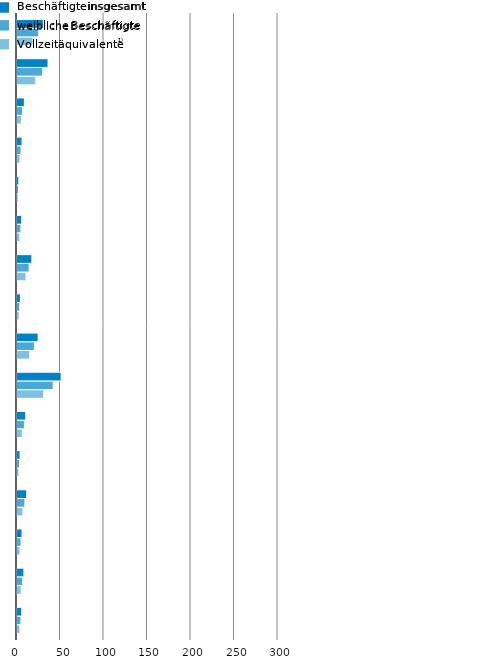
| Category | VZÄ | wB | iB |
|---|---|---|---|
| Thüringen      | 3.334 | 4.5 | 5.509 |
| Schleswig-Holstein | 4.821 | 6.616 | 7.966 |
| Sachsen-Anhalt | 3.498 | 4.671 | 5.779 |
| Sachsen        | 6.768 | 9.048 | 11.182 |
| Saarland | 2.125 | 2.877 | 3.51 |
| Rheinland-Pfalz | 6.108 | 8.546 | 10.092 |
| Nordrhein-Westfalen | 30.719 | 41.641 | 50.753 |
| Niedersachsen | 14.703 | 20.042 | 24.293 |
| Mecklenburg-Vorpommern | 2.39 | 3.188 | 3.948 |
| Hessen         | 10.358 | 13.984 | 17.114 |
| Hamburg | 3.302 | 4.468 | 5.456 |
| Bremen | 1.297 | 1.759 | 2.143 |
| Brandenburg | 3.494 | 4.644 | 5.772 |
| Berlin | 5.134 | 6.542 | 8.482 |
| Bayern | 21.595 | 29.465 | 35.678 |
| Baden-Württemberg | 18.353 | 25.008 | 30.323 |